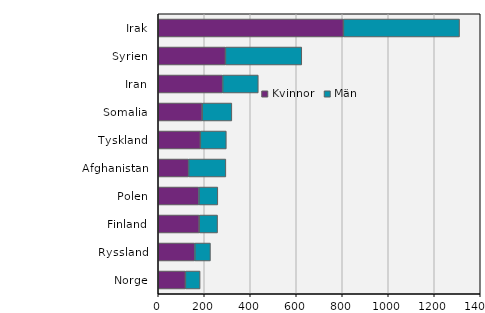
| Category | Kvinnor | Män |
|---|---|---|
| Norge | 118 | 64 |
| Ryssland | 159 | 68 |
| Finland | 178 | 80 |
| Polen | 177 | 82 |
| Afghanistan | 132 | 162 |
| Tyskland | 183 | 113 |
| Somalia | 191 | 129 |
| Iran | 280 | 155 |
| Syrien | 292 | 332 |
| Irak | 805 | 505 |